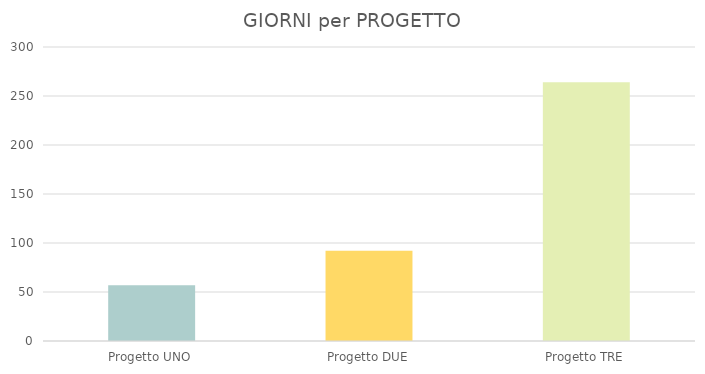
| Category | N. di GIORNI |
|---|---|
| Progetto UNO | 57 |
| Progetto DUE | 92 |
| Progetto TRE | 264 |